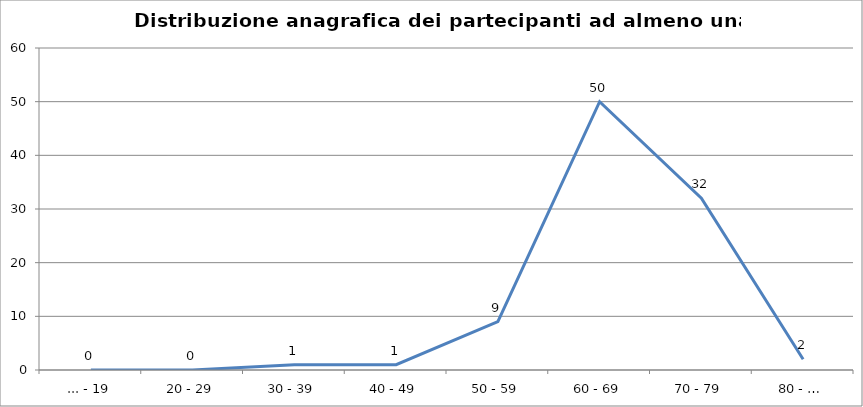
| Category | Nr. Tesserati |
|---|---|
| ... - 19 | 0 |
| 20 - 29 | 0 |
| 30 - 39 | 1 |
| 40 - 49 | 1 |
| 50 - 59 | 9 |
| 60 - 69 | 50 |
| 70 - 79 | 32 |
| 80 - … | 2 |